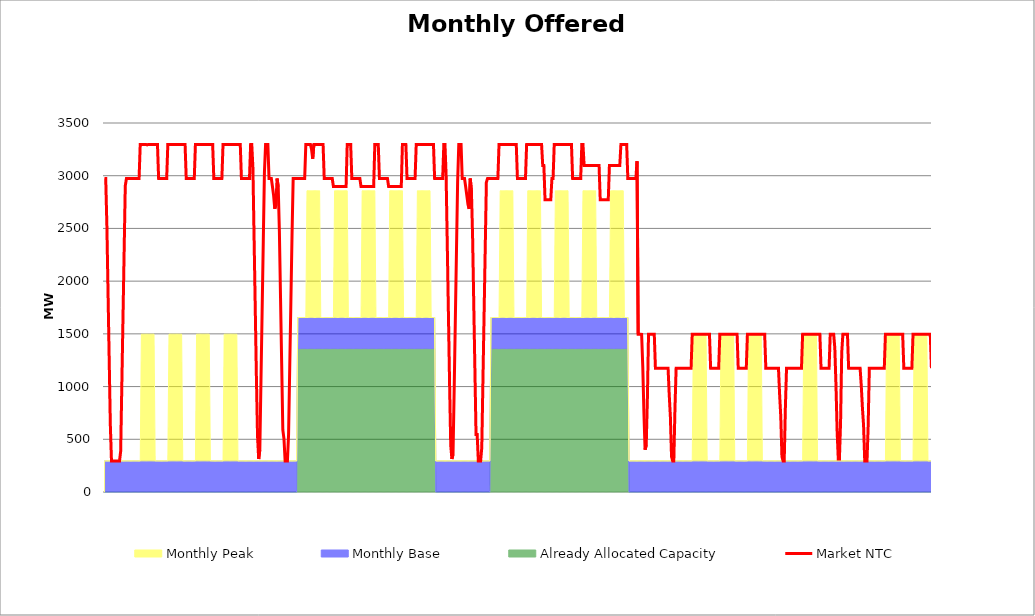
| Category | Market NTC |
|---|---|
| 0 | 2973 |
| 1 | 2973 |
| 2 | 2527 |
| 3 | 1897 |
| 4 | 1268 |
| 5 | 639 |
| 6 | 295 |
| 7 | 295 |
| 8 | 295 |
| 9 | 295 |
| 10 | 295 |
| 11 | 295 |
| 12 | 295 |
| 13 | 295 |
| 14 | 387 |
| 15 | 1016 |
| 16 | 1645 |
| 17 | 2275 |
| 18 | 2904 |
| 19 | 2973 |
| 20 | 2973 |
| 21 | 2973 |
| 22 | 2973 |
| 23 | 2973 |
| 24 | 2973 |
| 25 | 2973 |
| 26 | 2973 |
| 27 | 2973 |
| 28 | 2973 |
| 29 | 2973 |
| 30 | 2973 |
| 31 | 3297 |
| 32 | 3297 |
| 33 | 3297 |
| 34 | 3297 |
| 35 | 3297 |
| 36 | 3297 |
| 37 | 3292 |
| 38 | 3297 |
| 39 | 3297 |
| 40 | 3297 |
| 41 | 3297 |
| 42 | 3297 |
| 43 | 3297 |
| 44 | 3297 |
| 45 | 3297 |
| 46 | 3297 |
| 47 | 2973 |
| 48 | 2973 |
| 49 | 2973 |
| 50 | 2973 |
| 51 | 2973 |
| 52 | 2973 |
| 53 | 2973 |
| 54 | 2973 |
| 55 | 3297 |
| 56 | 3297 |
| 57 | 3297 |
| 58 | 3297 |
| 59 | 3297 |
| 60 | 3297 |
| 61 | 3297 |
| 62 | 3297 |
| 63 | 3297 |
| 64 | 3297 |
| 65 | 3297 |
| 66 | 3297 |
| 67 | 3297 |
| 68 | 3297 |
| 69 | 3297 |
| 70 | 3297 |
| 71 | 2973 |
| 72 | 2973 |
| 73 | 2973 |
| 74 | 2973 |
| 75 | 2973 |
| 76 | 2973 |
| 77 | 2973 |
| 78 | 2973 |
| 79 | 3297 |
| 80 | 3297 |
| 81 | 3297 |
| 82 | 3297 |
| 83 | 3297 |
| 84 | 3297 |
| 85 | 3297 |
| 86 | 3297 |
| 87 | 3297 |
| 88 | 3297 |
| 89 | 3297 |
| 90 | 3297 |
| 91 | 3297 |
| 92 | 3297 |
| 93 | 3297 |
| 94 | 3297 |
| 95 | 2973 |
| 96 | 2973 |
| 97 | 2973 |
| 98 | 2973 |
| 99 | 2973 |
| 100 | 2973 |
| 101 | 2973 |
| 102 | 2973 |
| 103 | 3297 |
| 104 | 3297 |
| 105 | 3297 |
| 106 | 3297 |
| 107 | 3297 |
| 108 | 3297 |
| 109 | 3297 |
| 110 | 3297 |
| 111 | 3297 |
| 112 | 3297 |
| 113 | 3297 |
| 114 | 3297 |
| 115 | 3297 |
| 116 | 3297 |
| 117 | 3297 |
| 118 | 3297 |
| 119 | 2973 |
| 120 | 2973 |
| 121 | 2973 |
| 122 | 2973 |
| 123 | 2973 |
| 124 | 2973 |
| 125 | 2973 |
| 126 | 2973 |
| 127 | 3297 |
| 128 | 3297 |
| 129 | 3073 |
| 130 | 2416 |
| 131 | 1759 |
| 132 | 1102 |
| 133 | 532 |
| 134 | 313 |
| 135 | 401 |
| 136 | 1058 |
| 137 | 1715 |
| 138 | 2372 |
| 139 | 3030 |
| 140 | 3297 |
| 141 | 3297 |
| 142 | 3297 |
| 143 | 2973 |
| 144 | 2973 |
| 145 | 2973 |
| 146 | 2896 |
| 147 | 2812 |
| 148 | 2686 |
| 149 | 2728 |
| 150 | 2973 |
| 151 | 2896 |
| 152 | 2476 |
| 153 | 1847 |
| 154 | 1218 |
| 155 | 588 |
| 156 | 504 |
| 157 | 295 |
| 158 | 295 |
| 159 | 295 |
| 160 | 546 |
| 161 | 1176 |
| 162 | 1805 |
| 163 | 2434 |
| 164 | 2973 |
| 165 | 2973 |
| 166 | 2973 |
| 167 | 2973 |
| 168 | 2973 |
| 169 | 2973 |
| 170 | 2973 |
| 171 | 2973 |
| 172 | 2973 |
| 173 | 2973 |
| 174 | 2973 |
| 175 | 3297 |
| 176 | 3297 |
| 177 | 3297 |
| 178 | 3297 |
| 179 | 3297 |
| 180 | 3249 |
| 181 | 3161 |
| 182 | 3297 |
| 183 | 3297 |
| 184 | 3297 |
| 185 | 3297 |
| 186 | 3297 |
| 187 | 3297 |
| 188 | 3297 |
| 189 | 3297 |
| 190 | 3297 |
| 191 | 2973 |
| 192 | 2973 |
| 193 | 2973 |
| 194 | 2973 |
| 195 | 2973 |
| 196 | 2973 |
| 197 | 2973 |
| 198 | 2973 |
| 199 | 2897 |
| 200 | 2897 |
| 201 | 2897 |
| 202 | 2897 |
| 203 | 2897 |
| 204 | 2897 |
| 205 | 2897 |
| 206 | 2897 |
| 207 | 2897 |
| 208 | 2897 |
| 209 | 2897 |
| 210 | 2897 |
| 211 | 3297 |
| 212 | 3297 |
| 213 | 3297 |
| 214 | 3297 |
| 215 | 2973 |
| 216 | 2973 |
| 217 | 2973 |
| 218 | 2973 |
| 219 | 2973 |
| 220 | 2973 |
| 221 | 2973 |
| 222 | 2973 |
| 223 | 2897 |
| 224 | 2897 |
| 225 | 2897 |
| 226 | 2897 |
| 227 | 2897 |
| 228 | 2897 |
| 229 | 2897 |
| 230 | 2897 |
| 231 | 2897 |
| 232 | 2897 |
| 233 | 2897 |
| 234 | 2897 |
| 235 | 3297 |
| 236 | 3297 |
| 237 | 3297 |
| 238 | 3297 |
| 239 | 2973 |
| 240 | 2973 |
| 241 | 2973 |
| 242 | 2973 |
| 243 | 2973 |
| 244 | 2973 |
| 245 | 2973 |
| 246 | 2973 |
| 247 | 2897 |
| 248 | 2897 |
| 249 | 2897 |
| 250 | 2897 |
| 251 | 2897 |
| 252 | 2897 |
| 253 | 2897 |
| 254 | 2897 |
| 255 | 2897 |
| 256 | 2897 |
| 257 | 2897 |
| 258 | 2897 |
| 259 | 3297 |
| 260 | 3297 |
| 261 | 3297 |
| 262 | 3297 |
| 263 | 2973 |
| 264 | 2973 |
| 265 | 2973 |
| 266 | 2973 |
| 267 | 2973 |
| 268 | 2973 |
| 269 | 2973 |
| 270 | 2973 |
| 271 | 3297 |
| 272 | 3297 |
| 273 | 3297 |
| 274 | 3297 |
| 275 | 3297 |
| 276 | 3297 |
| 277 | 3297 |
| 278 | 3297 |
| 279 | 3297 |
| 280 | 3297 |
| 281 | 3297 |
| 282 | 3297 |
| 283 | 3297 |
| 284 | 3297 |
| 285 | 3297 |
| 286 | 3297 |
| 287 | 2973 |
| 288 | 2973 |
| 289 | 2973 |
| 290 | 2973 |
| 291 | 2973 |
| 292 | 2973 |
| 293 | 2973 |
| 294 | 2973 |
| 295 | 3297 |
| 296 | 3297 |
| 297 | 3001 |
| 298 | 2344 |
| 299 | 1687 |
| 300 | 1030 |
| 301 | 445 |
| 302 | 313 |
| 303 | 357 |
| 304 | 970 |
| 305 | 1628 |
| 306 | 2285 |
| 307 | 2942 |
| 308 | 3297 |
| 309 | 3297 |
| 310 | 3297 |
| 311 | 2973 |
| 312 | 2973 |
| 313 | 2973 |
| 314 | 2896 |
| 315 | 2812 |
| 316 | 2728 |
| 317 | 2686 |
| 318 | 2973 |
| 319 | 2854 |
| 320 | 2434 |
| 321 | 1805 |
| 322 | 1176 |
| 323 | 546 |
| 324 | 546 |
| 325 | 295 |
| 326 | 295 |
| 327 | 295 |
| 328 | 420 |
| 329 | 1050 |
| 330 | 1679 |
| 331 | 2308 |
| 332 | 2938 |
| 333 | 2973 |
| 334 | 2973 |
| 335 | 2973 |
| 336 | 2973 |
| 337 | 2973 |
| 338 | 2973 |
| 339 | 2973 |
| 340 | 2973 |
| 341 | 2973 |
| 342 | 2973 |
| 343 | 3297 |
| 344 | 3297 |
| 345 | 3297 |
| 346 | 3297 |
| 347 | 3297 |
| 348 | 3297 |
| 349 | 3297 |
| 350 | 3297 |
| 351 | 3297 |
| 352 | 3297 |
| 353 | 3297 |
| 354 | 3297 |
| 355 | 3297 |
| 356 | 3297 |
| 357 | 3297 |
| 358 | 3297 |
| 359 | 2973 |
| 360 | 2973 |
| 361 | 2973 |
| 362 | 2973 |
| 363 | 2973 |
| 364 | 2973 |
| 365 | 2973 |
| 366 | 2973 |
| 367 | 3297 |
| 368 | 3297 |
| 369 | 3297 |
| 370 | 3297 |
| 371 | 3297 |
| 372 | 3297 |
| 373 | 3297 |
| 374 | 3297 |
| 375 | 3297 |
| 376 | 3297 |
| 377 | 3297 |
| 378 | 3297 |
| 379 | 3297 |
| 380 | 3297 |
| 381 | 3097 |
| 382 | 3097 |
| 383 | 2773 |
| 384 | 2773 |
| 385 | 2773 |
| 386 | 2773 |
| 387 | 2773 |
| 388 | 2773 |
| 389 | 2973 |
| 390 | 2973 |
| 391 | 3297 |
| 392 | 3297 |
| 393 | 3297 |
| 394 | 3297 |
| 395 | 3297 |
| 396 | 3297 |
| 397 | 3297 |
| 398 | 3297 |
| 399 | 3297 |
| 400 | 3297 |
| 401 | 3297 |
| 402 | 3297 |
| 403 | 3297 |
| 404 | 3297 |
| 405 | 3297 |
| 406 | 3297 |
| 407 | 2973 |
| 408 | 2973 |
| 409 | 2973 |
| 410 | 2973 |
| 411 | 2973 |
| 412 | 2973 |
| 413 | 2973 |
| 414 | 2973 |
| 415 | 3297 |
| 416 | 3297 |
| 417 | 3097 |
| 418 | 3097 |
| 419 | 3097 |
| 420 | 3097 |
| 421 | 3097 |
| 422 | 3097 |
| 423 | 3097 |
| 424 | 3097 |
| 425 | 3097 |
| 426 | 3097 |
| 427 | 3097 |
| 428 | 3097 |
| 429 | 3097 |
| 430 | 3097 |
| 431 | 2773 |
| 432 | 2773 |
| 433 | 2773 |
| 434 | 2773 |
| 435 | 2773 |
| 436 | 2773 |
| 437 | 2773 |
| 438 | 2773 |
| 439 | 3097 |
| 440 | 3097 |
| 441 | 3097 |
| 442 | 3097 |
| 443 | 3097 |
| 444 | 3097 |
| 445 | 3097 |
| 446 | 3097 |
| 447 | 3097 |
| 448 | 3097 |
| 449 | 3297 |
| 450 | 3297 |
| 451 | 3297 |
| 452 | 3297 |
| 453 | 3297 |
| 454 | 3297 |
| 455 | 2973 |
| 456 | 2973 |
| 457 | 2973 |
| 458 | 2973 |
| 459 | 2973 |
| 460 | 2973 |
| 461 | 2973 |
| 462 | 2973 |
| 463 | 3138 |
| 464 | 1497 |
| 465 | 1497 |
| 466 | 1497 |
| 467 | 1496 |
| 468 | 1189 |
| 469 | 751 |
| 470 | 401 |
| 471 | 445 |
| 472 | 883 |
| 473 | 1497 |
| 474 | 1497 |
| 475 | 1497 |
| 476 | 1497 |
| 477 | 1497 |
| 478 | 1497 |
| 479 | 1173 |
| 480 | 1173 |
| 481 | 1173 |
| 482 | 1173 |
| 483 | 1173 |
| 484 | 1173 |
| 485 | 1173 |
| 486 | 1173 |
| 487 | 1173 |
| 488 | 1173 |
| 489 | 1173 |
| 490 | 1173 |
| 491 | 924 |
| 492 | 714 |
| 493 | 336 |
| 494 | 295 |
| 495 | 295 |
| 496 | 798 |
| 497 | 1173 |
| 498 | 1173 |
| 499 | 1173 |
| 500 | 1173 |
| 501 | 1173 |
| 502 | 1173 |
| 503 | 1173 |
| 504 | 1173 |
| 505 | 1173 |
| 506 | 1173 |
| 507 | 1173 |
| 508 | 1173 |
| 509 | 1173 |
| 510 | 1173 |
| 511 | 1497 |
| 512 | 1497 |
| 513 | 1497 |
| 514 | 1497 |
| 515 | 1497 |
| 516 | 1497 |
| 517 | 1497 |
| 518 | 1497 |
| 519 | 1497 |
| 520 | 1497 |
| 521 | 1497 |
| 522 | 1497 |
| 523 | 1497 |
| 524 | 1497 |
| 525 | 1497 |
| 526 | 1497 |
| 527 | 1173 |
| 528 | 1173 |
| 529 | 1173 |
| 530 | 1173 |
| 531 | 1173 |
| 532 | 1173 |
| 533 | 1173 |
| 534 | 1173 |
| 535 | 1497 |
| 536 | 1497 |
| 537 | 1497 |
| 538 | 1497 |
| 539 | 1497 |
| 540 | 1497 |
| 541 | 1497 |
| 542 | 1497 |
| 543 | 1497 |
| 544 | 1497 |
| 545 | 1497 |
| 546 | 1497 |
| 547 | 1497 |
| 548 | 1497 |
| 549 | 1497 |
| 550 | 1497 |
| 551 | 1173 |
| 552 | 1173 |
| 553 | 1173 |
| 554 | 1173 |
| 555 | 1173 |
| 556 | 1173 |
| 557 | 1173 |
| 558 | 1173 |
| 559 | 1497 |
| 560 | 1497 |
| 561 | 1497 |
| 562 | 1497 |
| 563 | 1497 |
| 564 | 1497 |
| 565 | 1497 |
| 566 | 1497 |
| 567 | 1497 |
| 568 | 1497 |
| 569 | 1497 |
| 570 | 1497 |
| 571 | 1497 |
| 572 | 1497 |
| 573 | 1497 |
| 574 | 1497 |
| 575 | 1173 |
| 576 | 1173 |
| 577 | 1173 |
| 578 | 1173 |
| 579 | 1173 |
| 580 | 1173 |
| 581 | 1173 |
| 582 | 1173 |
| 583 | 1173 |
| 584 | 1173 |
| 585 | 1173 |
| 586 | 1173 |
| 587 | 924 |
| 588 | 714 |
| 589 | 336 |
| 590 | 295 |
| 591 | 295 |
| 592 | 798 |
| 593 | 1173 |
| 594 | 1173 |
| 595 | 1173 |
| 596 | 1173 |
| 597 | 1173 |
| 598 | 1173 |
| 599 | 1173 |
| 600 | 1173 |
| 601 | 1173 |
| 602 | 1173 |
| 603 | 1173 |
| 604 | 1173 |
| 605 | 1173 |
| 606 | 1173 |
| 607 | 1497 |
| 608 | 1497 |
| 609 | 1497 |
| 610 | 1497 |
| 611 | 1497 |
| 612 | 1497 |
| 613 | 1497 |
| 614 | 1497 |
| 615 | 1497 |
| 616 | 1497 |
| 617 | 1497 |
| 618 | 1497 |
| 619 | 1497 |
| 620 | 1497 |
| 621 | 1497 |
| 622 | 1497 |
| 623 | 1173 |
| 624 | 1173 |
| 625 | 1173 |
| 626 | 1173 |
| 627 | 1173 |
| 628 | 1173 |
| 629 | 1173 |
| 630 | 1173 |
| 631 | 1497 |
| 632 | 1497 |
| 633 | 1497 |
| 634 | 1497 |
| 635 | 1365 |
| 636 | 1014 |
| 637 | 576 |
| 638 | 313 |
| 639 | 313 |
| 640 | 664 |
| 641 | 1321 |
| 642 | 1497 |
| 643 | 1497 |
| 644 | 1497 |
| 645 | 1497 |
| 646 | 1497 |
| 647 | 1173 |
| 648 | 1173 |
| 649 | 1173 |
| 650 | 1173 |
| 651 | 1173 |
| 652 | 1173 |
| 653 | 1173 |
| 654 | 1173 |
| 655 | 1173 |
| 656 | 1173 |
| 657 | 1173 |
| 658 | 1008 |
| 659 | 798 |
| 660 | 630 |
| 661 | 295 |
| 662 | 295 |
| 663 | 295 |
| 664 | 630 |
| 665 | 1173 |
| 666 | 1173 |
| 667 | 1173 |
| 668 | 1173 |
| 669 | 1173 |
| 670 | 1173 |
| 671 | 1173 |
| 672 | 1173 |
| 673 | 1173 |
| 674 | 1173 |
| 675 | 1173 |
| 676 | 1173 |
| 677 | 1173 |
| 678 | 1173 |
| 679 | 1497 |
| 680 | 1497 |
| 681 | 1497 |
| 682 | 1497 |
| 683 | 1497 |
| 684 | 1497 |
| 685 | 1497 |
| 686 | 1497 |
| 687 | 1497 |
| 688 | 1497 |
| 689 | 1497 |
| 690 | 1497 |
| 691 | 1497 |
| 692 | 1497 |
| 693 | 1497 |
| 694 | 1497 |
| 695 | 1173 |
| 696 | 1173 |
| 697 | 1173 |
| 698 | 1173 |
| 699 | 1173 |
| 700 | 1173 |
| 701 | 1173 |
| 702 | 1173 |
| 703 | 1497 |
| 704 | 1497 |
| 705 | 1497 |
| 706 | 1497 |
| 707 | 1497 |
| 708 | 1497 |
| 709 | 1497 |
| 710 | 1497 |
| 711 | 1497 |
| 712 | 1497 |
| 713 | 1497 |
| 714 | 1497 |
| 715 | 1497 |
| 716 | 1497 |
| 717 | 1497 |
| 718 | 1497 |
| 719 | 1173 |